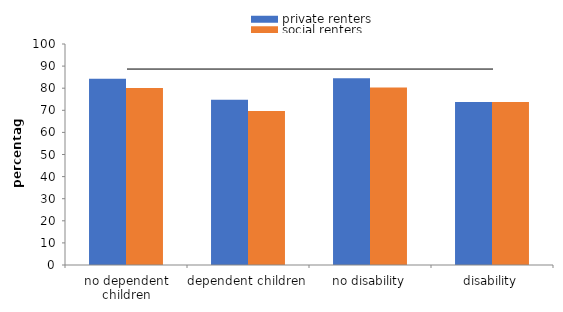
| Category | private renters | social renters |
|---|---|---|
| no dependent children | 84.279 | 80.135 |
| dependent children | 74.776 | 69.691 |
| no disability | 84.464 | 80.358 |
| disability | 73.753 | 73.73 |